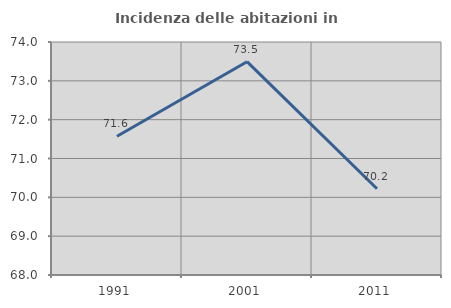
| Category | Incidenza delle abitazioni in proprietà  |
|---|---|
| 1991.0 | 71.573 |
| 2001.0 | 73.493 |
| 2011.0 | 70.22 |